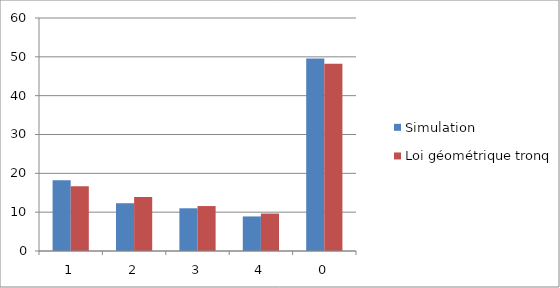
| Category | Simulation | Loi géométrique tronquée |
|---|---|---|
| 1.0 | 18.2 | 16.667 |
| 2.0 | 12.3 | 13.889 |
| 3.0 | 11 | 11.574 |
| 4.0 | 8.9 | 9.645 |
| 0.0 | 49.6 | 48.225 |